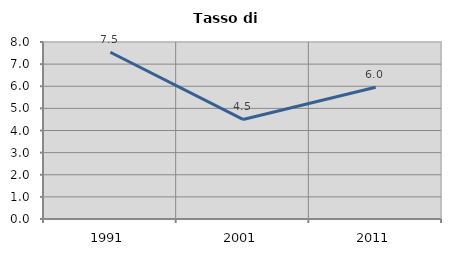
| Category | Tasso di disoccupazione   |
|---|---|
| 1991.0 | 7.536 |
| 2001.0 | 4.499 |
| 2011.0 | 5.955 |